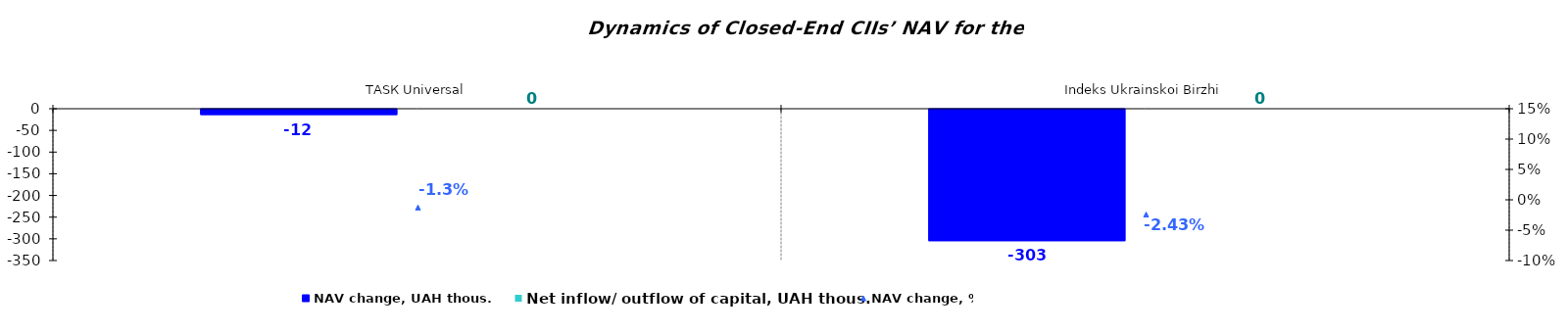
| Category | NAV change, UAH thous. | Net inflow/ outflow of capital, UAH thous. |
|---|---|---|
| ТАSК Universal | -12.228 | 0 |
| Іndeks Ukrainskoi Birzhi | -303.195 | 0 |